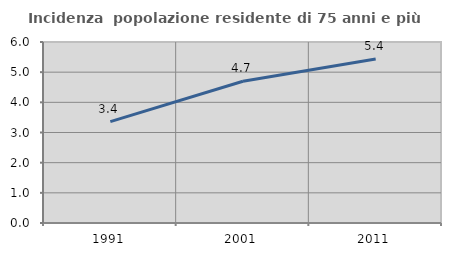
| Category | Incidenza  popolazione residente di 75 anni e più |
|---|---|
| 1991.0 | 3.36 |
| 2001.0 | 4.698 |
| 2011.0 | 5.433 |